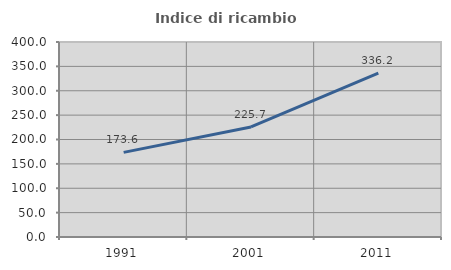
| Category | Indice di ricambio occupazionale  |
|---|---|
| 1991.0 | 173.554 |
| 2001.0 | 225.697 |
| 2011.0 | 336.15 |